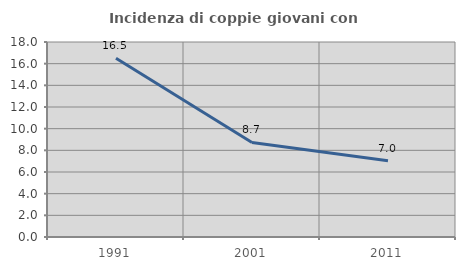
| Category | Incidenza di coppie giovani con figli |
|---|---|
| 1991.0 | 16.508 |
| 2001.0 | 8.729 |
| 2011.0 | 7.048 |